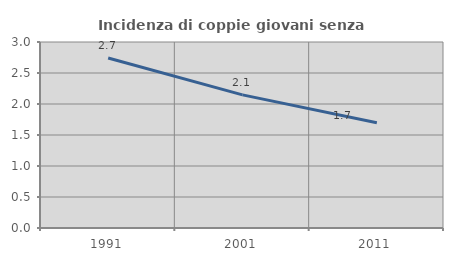
| Category | Incidenza di coppie giovani senza figli |
|---|---|
| 1991.0 | 2.743 |
| 2001.0 | 2.147 |
| 2011.0 | 1.699 |